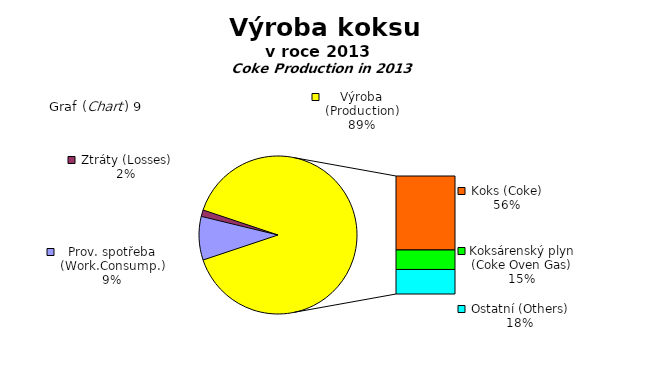
| Category | Series 0 |
|---|---|
| Prov. spotřeba (Work.Consump.) | 11236970.2 |
| Ztráty (Losses) | 1687157 |
| Koks (Coke) | 70859618 |
| Koksárenský plyn (Coke Oven Gas) | 18682006 |
| Ostatní (Others) | 23496592 |